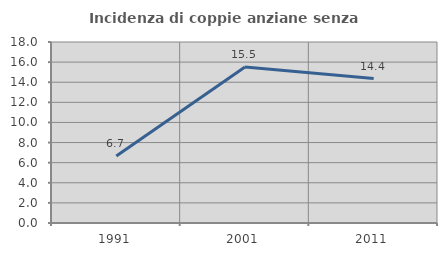
| Category | Incidenza di coppie anziane senza figli  |
|---|---|
| 1991.0 | 6.667 |
| 2001.0 | 15.508 |
| 2011.0 | 14.365 |